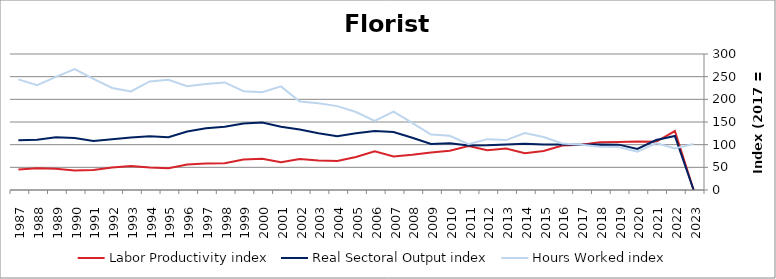
| Category | Labor Productivity index | Real Sectoral Output index | Hours Worked index |
|---|---|---|---|
| 2023.0 | 0 | 0 | 101.787 |
| 2022.0 | 130.087 | 119.31 | 91.715 |
| 2021.0 | 106.372 | 110.167 | 103.567 |
| 2020.0 | 106.946 | 90.484 | 84.608 |
| 2019.0 | 105.728 | 100.053 | 94.633 |
| 2018.0 | 105.422 | 100.539 | 95.368 |
| 2017.0 | 100 | 100 | 100 |
| 2016.0 | 97.953 | 100.352 | 102.449 |
| 2015.0 | 86.012 | 100.435 | 116.768 |
| 2014.0 | 81.211 | 102.174 | 125.814 |
| 2013.0 | 91.273 | 100.44 | 110.043 |
| 2012.0 | 87.951 | 98.638 | 112.152 |
| 2011.0 | 97.087 | 97.997 | 100.937 |
| 2010.0 | 86.484 | 103.357 | 119.51 |
| 2009.0 | 82.904 | 101.52 | 122.454 |
| 2008.0 | 77.907 | 115.246 | 147.928 |
| 2007.0 | 73.927 | 127.937 | 173.058 |
| 2006.0 | 85.162 | 129.971 | 152.617 |
| 2005.0 | 72.873 | 125.4 | 172.08 |
| 2004.0 | 64.111 | 118.609 | 185.005 |
| 2003.0 | 65.238 | 124.989 | 191.591 |
| 2002.0 | 68.277 | 133.303 | 195.239 |
| 2001.0 | 61.048 | 139.582 | 228.644 |
| 2000.0 | 69.008 | 148.858 | 215.71 |
| 1999.0 | 67.406 | 146.91 | 217.948 |
| 1998.0 | 58.888 | 139.706 | 237.24 |
| 1997.0 | 58.267 | 136.27 | 233.872 |
| 1996.0 | 56.278 | 128.904 | 229.049 |
| 1995.0 | 47.981 | 116.602 | 243.018 |
| 1994.0 | 49.485 | 118.526 | 239.518 |
| 1993.0 | 53.107 | 115.551 | 217.581 |
| 1992.0 | 49.832 | 112.127 | 225.01 |
| 1991.0 | 44.175 | 108.247 | 245.043 |
| 1990.0 | 42.936 | 114.519 | 266.722 |
| 1989.0 | 46.75 | 116.605 | 249.421 |
| 1988.0 | 48.03 | 111.115 | 231.342 |
| 1987.0 | 45.052 | 109.964 | 244.083 |